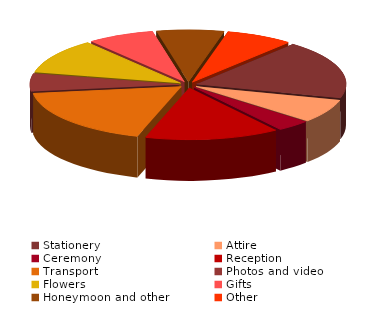
| Category | Series 0 |
|---|---|
| Stationery | 250 |
| Attire | 100 |
| Ceremony | 50 |
| Reception | 200 |
| Transport | 250 |
| Photos and video | 75 |
| Flowers | 150 |
| Gifts | 100 |
| Honeymoon and other | 100 |
| Other | 100 |